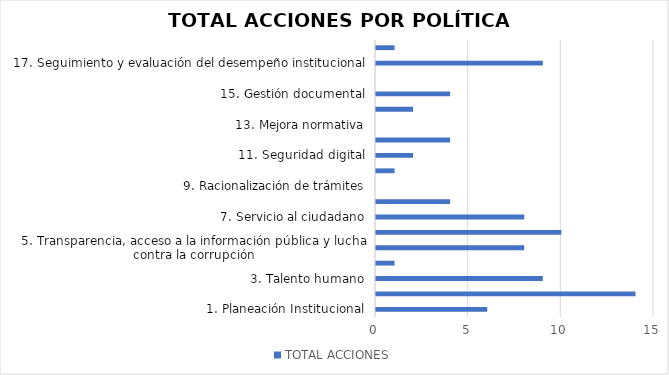
| Category | TOTAL ACCIONES |
|---|---|
| 1. Planeación Institucional | 6 |
| 2. Gestión presupuestal y eficiencia del gasto público | 14 |
| 3. Talento humano | 9 |
| 4. Integridad | 1 |
| 5. Transparencia, acceso a la información pública y lucha contra la corrupción | 8 |
| 6. Fortalecimiento organizacional y simplificación de procesos | 10 |
| 7. Servicio al ciudadano | 8 |
| 8. Participación ciudadana en la gestión pública | 4 |
| 9. Racionalización de trámites | 0 |
| 10. Gobierno digital | 1 |
| 11. Seguridad digital | 2 |
| 12. Defensa jurídica | 4 |
| 13. Mejora normativa | 0 |
| 14. Gestión del conocimiento y la innovación | 2 |
| 15. Gestión documental | 4 |
| 16. Gestión de la información estadística | 0 |
| 17. Seguimiento y evaluación del desempeño institucional | 9 |
| 18. Control interno | 1 |